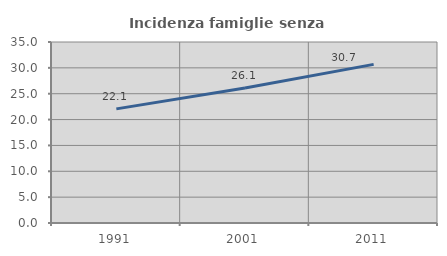
| Category | Incidenza famiglie senza nuclei |
|---|---|
| 1991.0 | 22.065 |
| 2001.0 | 26.12 |
| 2011.0 | 30.674 |